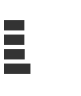
| Category | Series 0 |
|---|---|
| 0 | 0.269 |
| 1 | 0.269 |
| 2 | 0.274 |
| 3 | 0.354 |